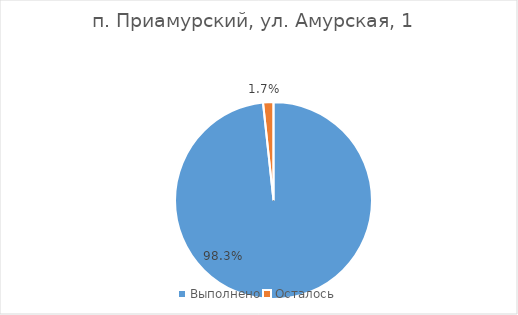
| Category | п. Приамурский, ул. Амурская, 1 |
|---|---|
| Выполнено | 0.983 |
| Осталось | 0.017 |